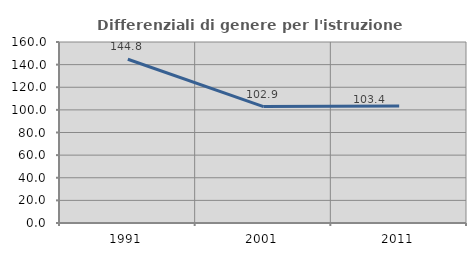
| Category | Differenziali di genere per l'istruzione superiore |
|---|---|
| 1991.0 | 144.757 |
| 2001.0 | 102.933 |
| 2011.0 | 103.378 |